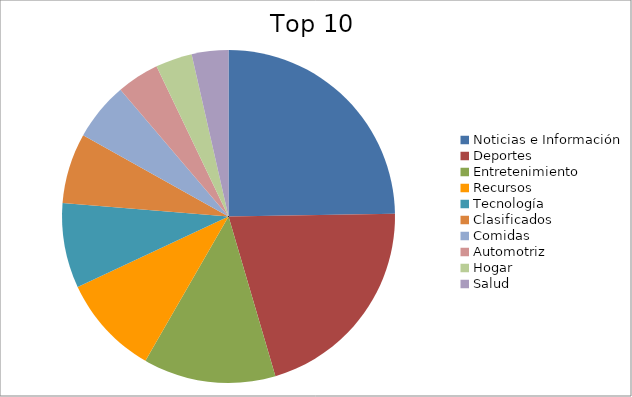
| Category | Series 0 |
|---|---|
| Noticias e Información | 21.01 |
| Deportes | 17.58 |
| Entretenimiento | 10.92 |
| Recursos | 8.26 |
| Tecnología | 7 |
| Clasificados | 5.79 |
| Comidas | 4.8 |
| Automotriz | 3.5 |
| Hogar | 3.02 |
| Salud | 3.02 |